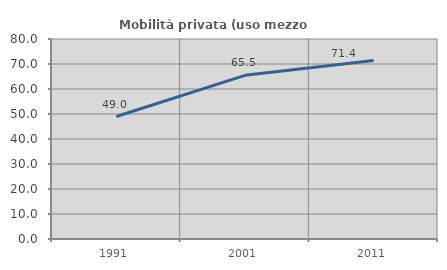
| Category | Mobilità privata (uso mezzo privato) |
|---|---|
| 1991.0 | 49 |
| 2001.0 | 65.472 |
| 2011.0 | 71.439 |